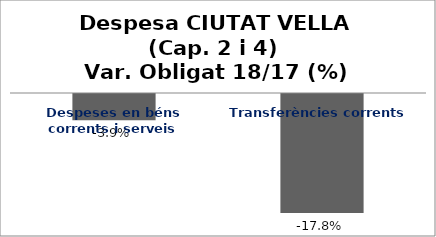
| Category | Series 0 |
|---|---|
| Despeses en béns corrents i serveis | -0.039 |
| Transferències corrents | -0.178 |